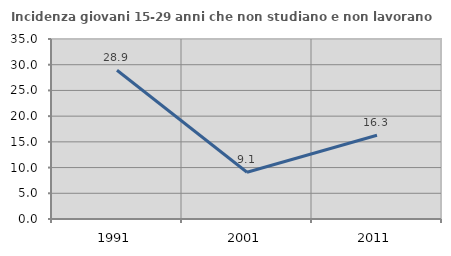
| Category | Incidenza giovani 15-29 anni che non studiano e non lavorano  |
|---|---|
| 1991.0 | 28.926 |
| 2001.0 | 9.091 |
| 2011.0 | 16.279 |